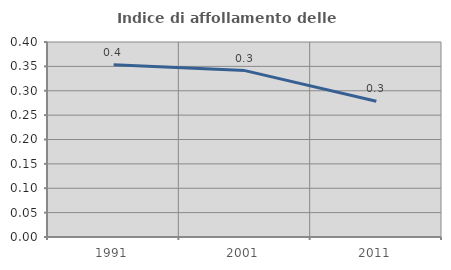
| Category | Indice di affollamento delle abitazioni  |
|---|---|
| 1991.0 | 0.353 |
| 2001.0 | 0.341 |
| 2011.0 | 0.279 |